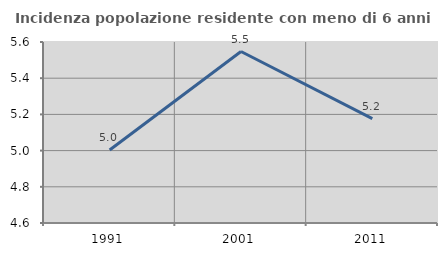
| Category | Incidenza popolazione residente con meno di 6 anni |
|---|---|
| 1991.0 | 5.003 |
| 2001.0 | 5.547 |
| 2011.0 | 5.177 |